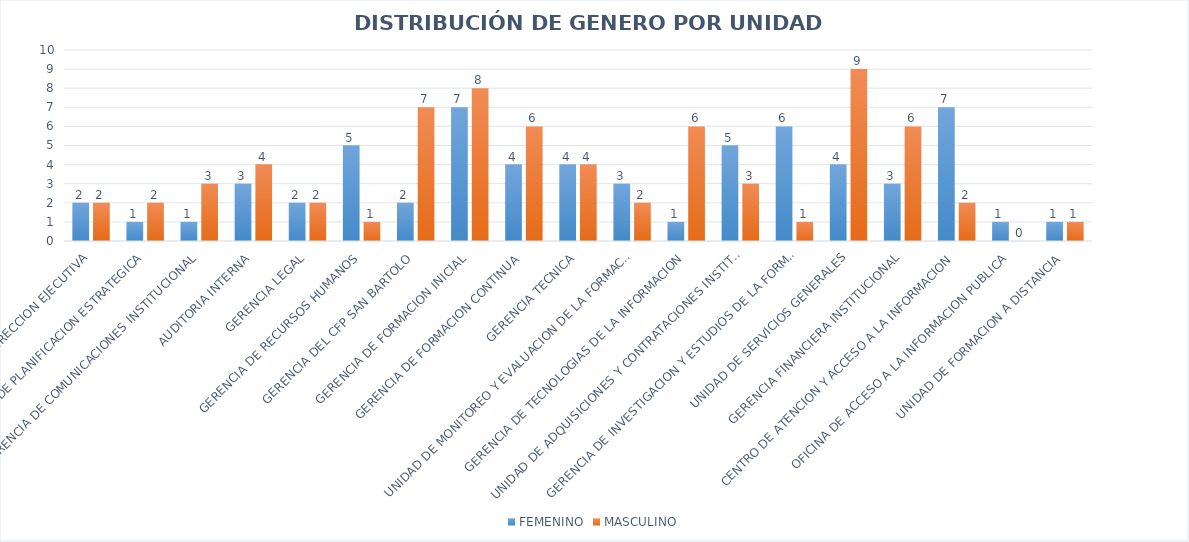
| Category | FEMENINO | MASCULINO |
|---|---|---|
| DIRECCION EJECUTIVA | 2 | 2 |
| UNIDAD DE PLANIFICACION ESTRATEGICA | 1 | 2 |
| GERENCIA DE COMUNICACIONES INSTITUCIONAL | 1 | 3 |
| AUDITORIA INTERNA | 3 | 4 |
| GERENCIA LEGAL | 2 | 2 |
| GERENCIA DE RECURSOS HUMANOS | 5 | 1 |
| GERENCIA DEL CFP SAN BARTOLO | 2 | 7 |
| GERENCIA DE FORMACION INICIAL | 7 | 8 |
| GERENCIA DE FORMACION CONTINUA | 4 | 6 |
| GERENCIA TECNICA | 4 | 4 |
| UNIDAD DE MONITOREO Y EVALUACION DE LA FORMACION PROFESIONAL | 3 | 2 |
| GERENCIA DE TECNOLOGIAS DE LA INFORMACION | 1 | 6 |
| UNIDAD DE ADQUISICIONES Y CONTRATACIONES INSTITUCIONAL | 5 | 3 |
| GERENCIA DE INVESTIGACION Y ESTUDIOS DE LA FORMACION PROFESIONAL | 6 | 1 |
| UNIDAD DE SERVICIOS GENERALES | 4 | 9 |
| GERENCIA FINANCIERA INSTITUCIONAL | 3 | 6 |
| CENTRO DE ATENCION Y ACCESO A LA INFORMACION | 7 | 2 |
| OFICINA DE ACCESO A LA INFORMACION PUBLICA | 1 | 0 |
| UNIDAD DE FORMACION A DISTANCIA | 1 | 1 |